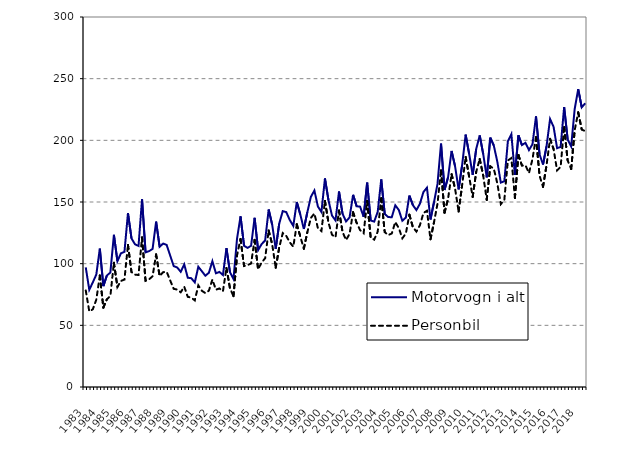
| Category | Motorvogn i alt | Personbil |
|---|---|---|
| 1983.0 | 97 | 78.3 |
| nan | 78.8 | 61.3 |
| nan | 84.8 | 63 |
| nan | 91.2 | 70.8 |
| 1984.0 | 112.2 | 90.4 |
| nan | 81.8 | 64.4 |
| nan | 90.4 | 71.1 |
| nan | 92.9 | 73.9 |
| 1985.0 | 123.4 | 100.8 |
| nan | 102 | 81.1 |
| nan | 108.4 | 86 |
| nan | 109.6 | 87.1 |
| 1986.0 | 141 | 115.2 |
| nan | 120.5 | 93.2 |
| nan | 115.7 | 91.1 |
| nan | 114.4 | 90.8 |
| 1987.0 | 152.2 | 121.3 |
| nan | 109.2 | 86.1 |
| nan | 110.1 | 87.3 |
| nan | 112 | 89.8 |
| 1988.0 | 134.1 | 107.5 |
| nan | 113.7 | 90 |
| nan | 116.3 | 93.1 |
| nan | 115.2 | 93.4 |
| 1989.0 | 106.6 | 86.4 |
| nan | 98 | 79.6 |
| nan | 96.9 | 79 |
| nan | 93.4 | 76.8 |
| 1990.0 | 99.4 | 81.3 |
| nan | 88.6 | 73.1 |
| nan | 88.2 | 72.5 |
| nan | 84.8 | 70.2 |
| 1991.0 | 97.5 | 82.4 |
| nan | 93.9 | 78 |
| nan | 90.2 | 76.1 |
| nan | 92.6 | 78.1 |
| 1992.0 | 102 | 87.1 |
| nan | 92.2 | 78.9 |
| nan | 93.3 | 79.9 |
| nan | 90.8 | 77.6 |
| 1993.0 | 112.6 | 96.5 |
| nan | 93 | 80.1 |
| nan | 87.5 | 73.6 |
| nan | 120.1 | 106.6 |
| 1994.0 | 138.4 | 120 |
| nan | 114.5 | 98.1 |
| nan | 112.8 | 98.8 |
| nan | 114.5 | 100.2 |
| 1995.0 | 137.2 | 119.3 |
| nan | 111 | 95.4 |
| nan | 115.9 | 101 |
| nan | 118.8 | 104.4 |
| 1996.0 | 143.9 | 126.9 |
| nan | 131.6 | 115.7 |
| nan | 112 | 96.7 |
| nan | 132.5 | 113.1 |
| 1997.0 | 142.6 | 124.8 |
| nan | 141.8 | 122.5 |
| nan | 135.4 | 117.3 |
| nan | 130.6 | 113.7 |
| 1998.0 | 150 | 131.9 |
| nan | 139.8 | 122 |
| nan | 128.1 | 112.1 |
| nan | 141.8 | 125.6 |
| 1999.0 | 154.2 | 137.1 |
| nan | 159.3 | 140.7 |
| nan | 146.3 | 128.7 |
| nan | 141.9 | 126.4 |
| 2000.0 | 169.1 | 150.9 |
| nan | 151.5 | 133.4 |
| nan | 139 | 123.5 |
| nan | 135.1 | 121.4 |
| 2001.0 | 158.5 | 143.1 |
| nan | 140.46 | 125.7 |
| nan | 134.24 | 119.2 |
| nan | 137.495 | 124.072 |
| 2002.0 | 155.814 | 141.724 |
| nan | 146.543 | 133.19 |
| nan | 146.231 | 127.141 |
| nan | 137.967 | 124.641 |
| 2003.0 | 165.679 | 150.811 |
| nan | 135.021 | 121.101 |
| nan | 134.111 | 119.491 |
| nan | 142.013 | 125.959 |
| 2004.0 | 168.309 | 153.043 |
| nan | 140.267 | 125.568 |
| nan | 137.77 | 123.121 |
| nan | 137.685 | 124.506 |
| 2005.0 | 147.311 | 133.756 |
| nan | 143.517 | 128.79 |
| nan | 134.783 | 120.571 |
| nan | 137.37 | 124.382 |
| 2006.0 | 155.213 | 139.728 |
| nan | 147.444 | 129.572 |
| nan | 143.451 | 126.006 |
| nan | 148.561 | 131.195 |
| 2007.0 | 158.1 | 141.084 |
| nan | 161.613 | 142.897 |
| nan | 135.821 | 119.753 |
| nan | 149.791 | 133.498 |
| 2008.0 | 164.642 | 148.614 |
| nan | 197.287 | 175.714 |
| nan | 159.718 | 141.407 |
| nan | 170.057 | 152.54 |
| 2009.0 | 191.38 | 172.559 |
| nan | 178.906 | 160.765 |
| nan | 160.234 | 142.312 |
| nan | 179.857 | 163.532 |
| 2010.0 | 204.636 | 186.507 |
| nan | 188.957 | 170.463 |
| nan | 172.077 | 154.156 |
| nan | 192.961 | 174.399 |
| 2011.0 | 204.005 | 184.86 |
| nan | 188.741 | 171.333 |
| nan | 169.934 | 151.694 |
| nan | 202.176 | 178.919 |
| 2012.0 | 195.829 | 177.072 |
| nan | 182.751 | 165.128 |
| nan | 165.73 | 148.242 |
| nan | 166.805 | 151.728 |
| 2013.0 | 199.181 | 183.653 |
| nan | 205.015 | 185.634 |
| nan | 172.044 | 153.21 |
| nan | 204.1 | 188.079 |
| 2014.0 | 196.177 | 179.552 |
| nan | 197.965 | 179.767 |
| nan | 192.105 | 173.474 |
| nan | 196.809 | 184.739 |
| 2015.0 | 219.419 | 202.592 |
| nan | 188.696 | 171.451 |
| nan | 180.388 | 162.297 |
| nan | 195.23 | 179.891 |
| 2016.0 | 217.298 | 201.197 |
| nan | 210.949 | 192.893 |
| nan | 193.648 | 175.642 |
| nan | 194.663 | 178.455 |
| 2017.0 | 227.029 | 210.738 |
| nan | 200.767 | 183.708 |
| nan | 195.059 | 176.766 |
| nan | 225.423 | 208.218 |
| 2018.0 | 241.528 | 222.678 |
| nan | 226.771 | 208.839 |
| nan | 230.044 | 207.395 |